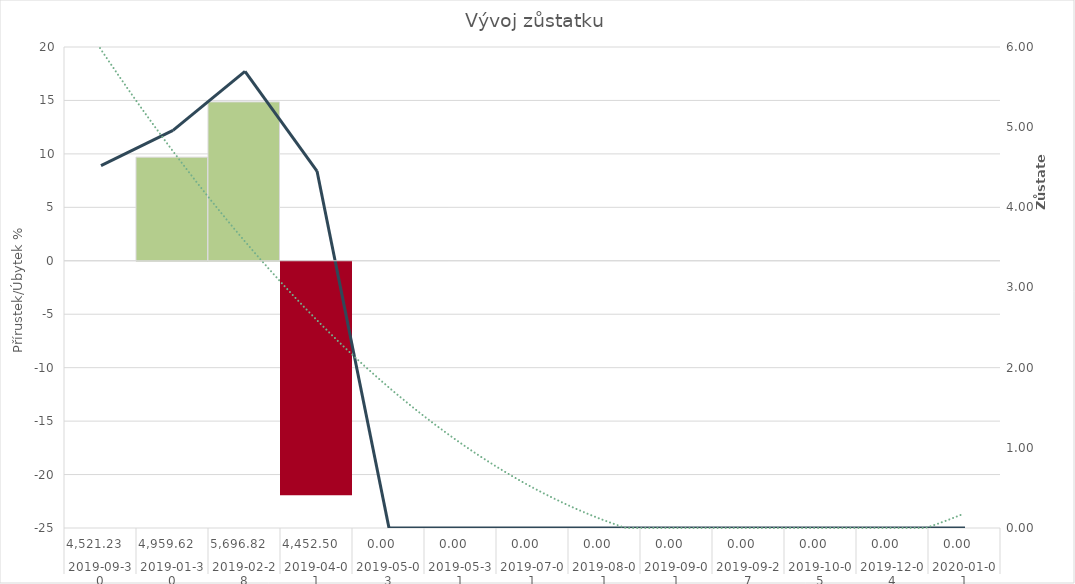
| Category | Series 0 | Series 1 |
|---|---|---|
| 0 | 0 | 0 |
| 1 | 0 | 9.696 |
| 2 | 0 | 14.864 |
| 3 | -21.842 | 0 |
| 4 | 0 | 0 |
| 5 | 0 | 0 |
| 6 | 0 | 0 |
| 7 | 0 | 0 |
| 8 | 0 | 0 |
| 9 | 0 | 0 |
| 10 | 0 | 0 |
| 11 | 0 | 0 |
| 12 | 0 | 0 |